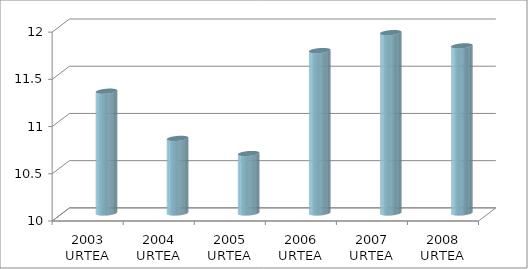
| Category | Series 0 | Series 1 |
|---|---|---|
| 2003 URTEA |  | 11.29 |
| 2004 URTEA |  | 10.79 |
| 2005 URTEA |  | 10.63 |
| 2006 URTEA |  | 11.72 |
| 2007 URTEA |  | 11.91 |
| 2008 URTEA |  | 11.77 |